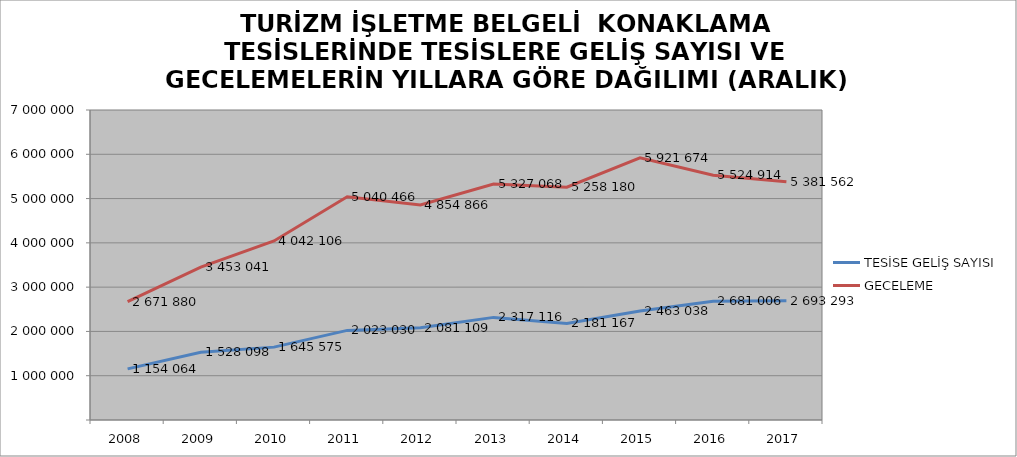
| Category | TESİSE GELİŞ SAYISI | GECELEME |
|---|---|---|
| 2008 | 1154064 | 2671880 |
| 2009 | 1528098 | 3453041 |
| 2010 | 1645575 | 4042106 |
| 2011 | 2023030 | 5040466 |
| 2012 | 2081109 | 4854866 |
| 2013 | 2317116 | 5327068 |
| 2014 | 2181167 | 5258180 |
| 2015 | 2463038 | 5921674 |
| 2016 | 2681006 | 5524914 |
| 2017 | 2693293 | 5381562 |